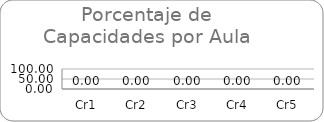
| Category | Series 0 |
|---|---|
| Cr1 | 0 |
| Cr2 | 0 |
| Cr3 | 0 |
| Cr4 | 0 |
| Cr5 | 0 |